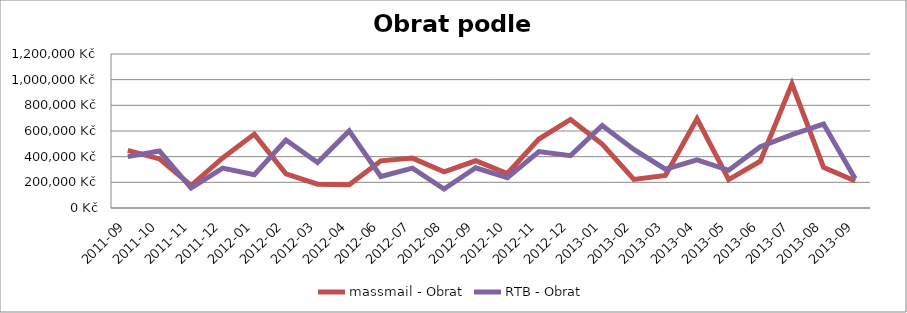
| Category | massmail - Obrat | RTB - Obrat |
|---|---|---|
| 2011-09 | 449472.624 | 400328.078 |
| 2011-10 | 382138.053 | 444584.805 |
| 2011-11 | 175194.824 | 155190.675 |
| 2011-12 | 390347.085 | 310663.688 |
| 2012-01 | 575842.452 | 258680.225 |
| 2012-02 | 265897.355 | 529440.135 |
| 2012-03 | 185853.998 | 354397.151 |
| 2012-04 | 180721.393 | 600621.149 |
| 2012-06 | 367290.418 | 245305.155 |
| 2012-07 | 388850.523 | 310086 |
| 2012-08 | 281980.573 | 147353.773 |
| 2012-09 | 367864.447 | 313526.257 |
| 2012-10 | 269138.743 | 236128.286 |
| 2012-11 | 537438.387 | 440137.451 |
| 2012-12 | 690214.374 | 407849.326 |
| 2013-01 | 497745.896 | 643484.084 |
| 2013-02 | 222622.551 | 456204.159 |
| 2013-03 | 253688.004 | 302218.017 |
| 2013-04 | 695506.491 | 375069.843 |
| 2013-05 | 221054.019 | 293624.167 |
| 2013-06 | 364691.421 | 477174.193 |
| 2013-07 | 966865.892 | 571662.449 |
| 2013-08 | 316456.847 | 654036.856 |
| 2013-09 | 210963.026 | 227356.535 |